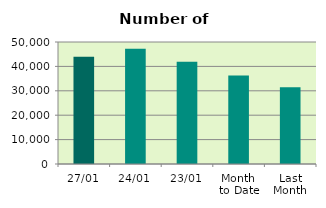
| Category | Series 0 |
|---|---|
| 27/01 | 43936 |
| 24/01 | 47190 |
| 23/01 | 41944 |
| Month 
to Date | 36317.333 |
| Last
Month | 31497.9 |